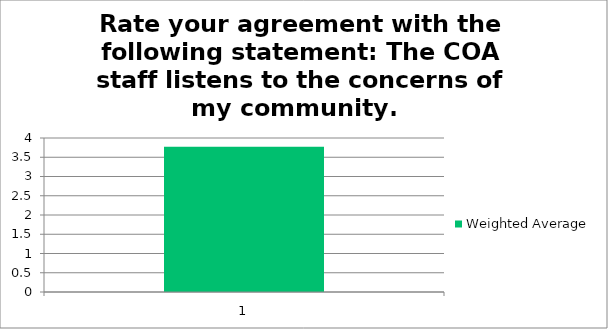
| Category | Weighted Average |
|---|---|
| 1.0 | 3.77 |